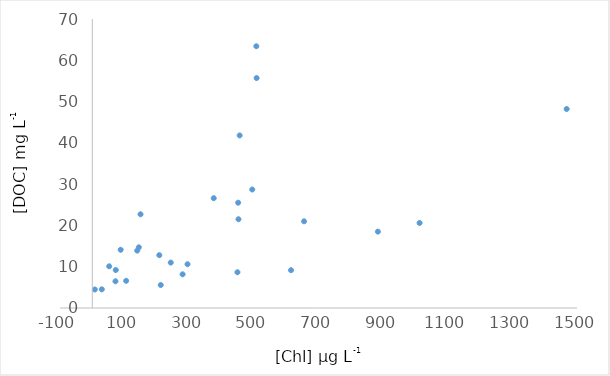
| Category | Series 0 |
|---|---|
| 279.4 | 8.16 |
| 294.6 | 10.6 |
| 451.3 | 25.5 |
| 456.0 | 41.8 |
| 508.5 | 55.7 |
| 507.6 | 63.4 |
| 1468.0 | 48.2 |
| 615.0 | 9.16 |
| 449.2 | 8.66 |
| 242.8 | 11 |
| 139.0 | 13.9 |
| 375.8 | 26.6 |
| 883.8 | 18.5 |
| 1012.9 | 20.6 |
| 7.8 | 4.48 |
| 29.4 | 4.52 |
| 71.7 | 6.47 |
| 207.3 | 12.8 |
| 87.8 | 14.1 |
| 52.3 | 10.1 |
| 72.6 | 9.2 |
| 104.7 | 6.58 |
| 211.8 | 5.57 |
| 144.0 | 14.7 |
| 149.2 | 22.7 |
| 495.0 | 28.7 |
| 452.4 | 21.5 |
| 655.3 | 21 |